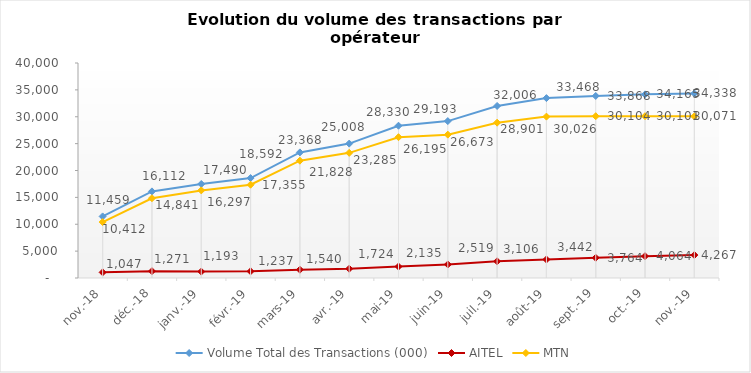
| Category | Volume Total des Transactions (000) | AITEL | MTN |
|---|---|---|---|
| 2018-11-01 | 11458.757 | 1046.981 | 10411.776 |
| 2018-12-01 | 16111.971 | 1271.092 | 14840.879 |
| 2019-01-01 | 17490.117 | 1192.882 | 16297.235 |
| 2019-02-01 | 18591.8 | 1236.897 | 17354.903 |
| 2019-03-01 | 23367.813 | 1540.25 | 21827.563 |
| 2019-04-01 | 25008.33 | 1723.759 | 23284.571 |
| 2019-05-01 | 28329.829 | 2134.873 | 26194.956 |
| 2019-06-01 | 29192.551 | 2519.316 | 26673.235 |
| 2019-07-01 | 32006.021 | 3105.517 | 28900.504 |
| 2019-08-01 | 33467.949 | 3441.961 | 30025.988 |
| 2019-09-01 | 33868.154 | 3763.821 | 30104.333 |
| 2019-10-01 | 34164.938 | 4063.918 | 30101.02 |
| 2019-11-01 | 34338.495 | 4267.012 | 30071.483 |